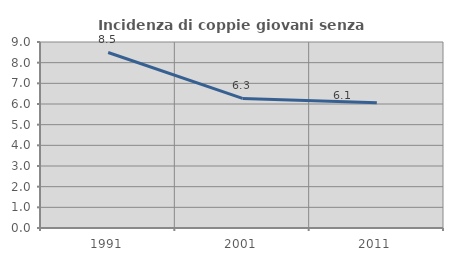
| Category | Incidenza di coppie giovani senza figli |
|---|---|
| 1991.0 | 8.493 |
| 2001.0 | 6.272 |
| 2011.0 | 6.061 |